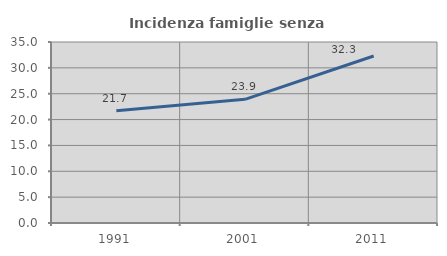
| Category | Incidenza famiglie senza nuclei |
|---|---|
| 1991.0 | 21.698 |
| 2001.0 | 23.916 |
| 2011.0 | 32.288 |